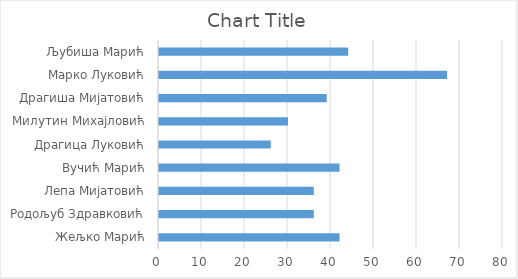
| Category | Series 0 |
|---|---|
| Жељко Марић | 42 |
| Родољуб Здравковић | 36 |
| Лепа Мијатовић | 36 |
| Вучић Марић | 42 |
| Драгица Луковић | 26 |
| Милутин Михајловић | 30 |
| Драгиша Мијатовић | 39 |
| Марко Луковић | 67 |
| Љубиша Марић | 44 |